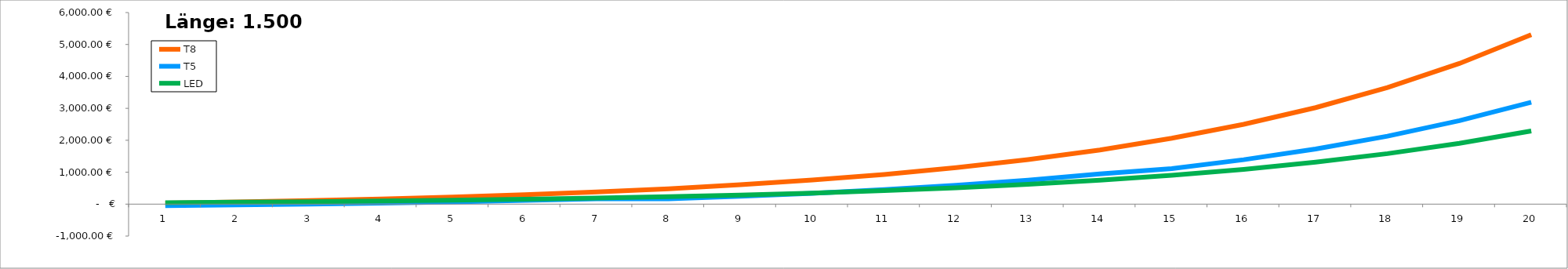
| Category | T8 | T5 | LED |
|---|---|---|---|
| 0 | 33.557 | -46.906 | 44.929 |
| 1 | 67.426 | -25.133 | 59.445 |
| 2 | 113.402 | 0.994 | 76.863 |
| 3 | 162.173 | 32.347 | 97.765 |
| 4 | 220.698 | 69.97 | 122.847 |
| 5 | 296.262 | 115.118 | 152.946 |
| 6 | 380.538 | 169.296 | 189.064 |
| 7 | 481.67 | 169.259 | 232.406 |
| 8 | 608.362 | 247.275 | 284.417 |
| 9 | 753.991 | 340.894 | 346.83 |
| 10 | 928.747 | 453.237 | 421.725 |
| 11 | 1143.787 | 588.049 | 511.599 |
| 12 | 1395.435 | 749.822 | 619.448 |
| 13 | 1697.412 | 943.951 | 748.867 |
| 14 | 2065.119 | 1111.855 | 904.17 |
| 15 | 2499.967 | 1391.4 | 1090.533 |
| 16 | 3021.784 | 1726.854 | 1314.169 |
| 17 | 3653.298 | 2129.399 | 1582.533 |
| 18 | 4404.715 | 2612.453 | 1904.568 |
| 19 | 5306.415 | 3192.117 | 2291.011 |